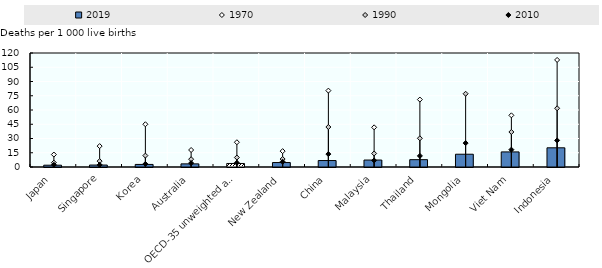
| Category | 2019 |
|---|---|
| Japan | 1.9 |
| Singapore | 2.05 |
| Korea | 2.7 |
| Australia | 3.3 |
| OECD-35 unweighted average (c) | 3.711 |
| New Zealand | 4.7 |
| China | 6.8 |
| Malaysia | 7.321 |
| Thailand | 7.721 |
| Mongolia | 13.447 |
| Viet Nam | 15.885 |
| Indonesia | 20.2 |